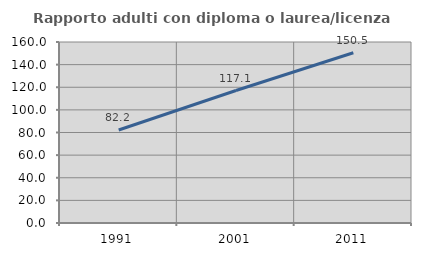
| Category | Rapporto adulti con diploma o laurea/licenza media  |
|---|---|
| 1991.0 | 82.227 |
| 2001.0 | 117.11 |
| 2011.0 | 150.488 |